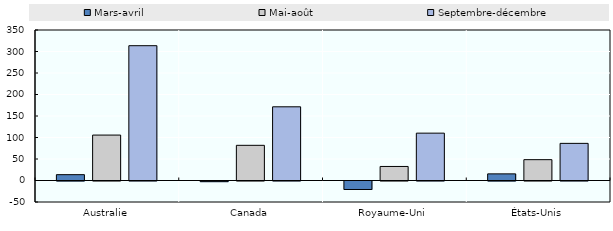
| Category | Mars-avril | Mai-août | Septembre-décembre |
|---|---|---|---|
| Australie | 13.588 | 105.664 | 313.492 |
| Canada | -1.505 | 81.823 | 171.378 |
| Royaume-Uni | -19.754 | 32.647 | 110.133 |
| États-Unis | 15.418 | 48.457 | 86.373 |